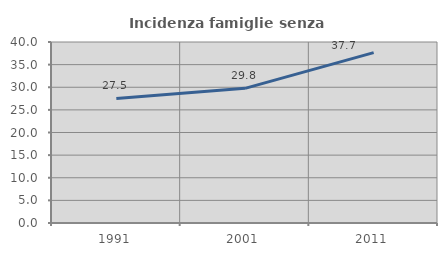
| Category | Incidenza famiglie senza nuclei |
|---|---|
| 1991.0 | 27.536 |
| 2001.0 | 29.758 |
| 2011.0 | 37.662 |